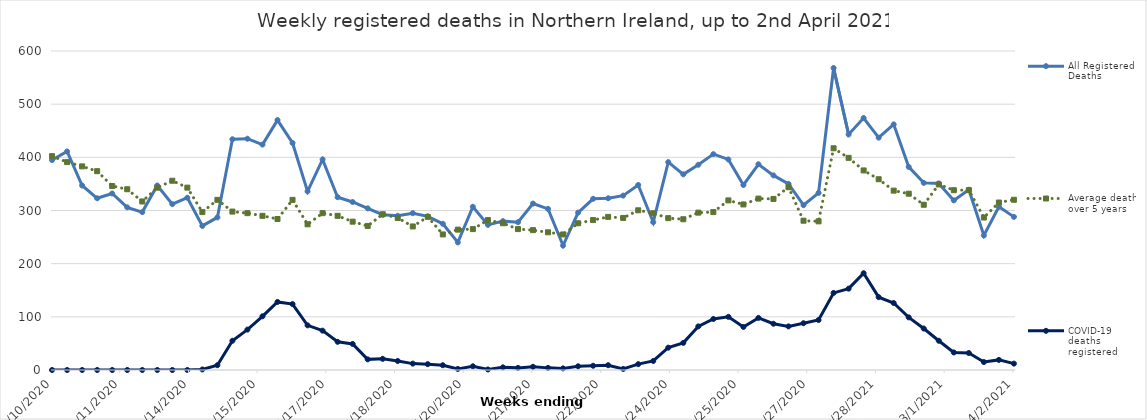
| Category | All Registered Deaths | Average deaths over 5 years | COVID-19 deaths registered |
|---|---|---|---|
| 1/10/20 | 395 | 402.2 | 0 |
| 1/17/20 | 411 | 391 | 0 |
| 1/24/20 | 347 | 383 | 0 |
| 1/31/20 | 323 | 374 | 0 |
| 2/7/20 | 332 | 346 | 0 |
| 2/14/20 | 306 | 340 | 0 |
| 2/21/20 | 297 | 317 | 0 |
| 2/28/20 | 347 | 343 | 0 |
| 3/6/20 | 312 | 356 | 0 |
| 3/13/20 | 324 | 343 | 0 |
| 3/20/20 | 271 | 297 | 1 |
| 3/27/20 | 287 | 320 | 9 |
| 4/3/20 | 434 | 298 | 55 |
| 4/10/20 | 435 | 295 | 76 |
| 4/17/20 | 424 | 290 | 101 |
| 4/24/20 | 470 | 284 | 128 |
| 5/1/20 | 427 | 320 | 124 |
| 5/8/20 | 336 | 274 | 84 |
| 5/15/20 | 396 | 295 | 74 |
| 5/22/20 | 325 | 290 | 53 |
| 5/29/20 | 316 | 279 | 49 |
| 6/5/20 | 304 | 271 | 20 |
| 6/12/20 | 292 | 293 | 21 |
| 6/19/20 | 290 | 286 | 17 |
| 6/26/20 | 295 | 270 | 12 |
| 7/3/20 | 289 | 288 | 11 |
| 7/10/20 | 275 | 255 | 9 |
| 7/17/20 | 240 | 264 | 2 |
| 7/24/20 | 307 | 265 | 7 |
| 7/31/20 | 273 | 282 | 1 |
| 8/7/20 | 280 | 276 | 5 |
| 8/14/20 | 278 | 265 | 4 |
| 8/21/20 | 313 | 263 | 6 |
| 8/28/20 | 303 | 259 | 4 |
| 9/4/20 | 234 | 255 | 3 |
| 9/11/20 | 296 | 276 | 7 |
| 9/18/20 | 322 | 282 | 8 |
| 9/25/20 | 323 | 288 | 9 |
| 10/2/20 | 328 | 286 | 2 |
| 10/9/20 | 348 | 300.4 | 11 |
| 10/16/20 | 278 | 294.8 | 17 |
| 10/23/20 | 391 | 285.6 | 42 |
| 10/30/20 | 368 | 283.6 | 51 |
| 11/6/20 | 386 | 296 | 82 |
| 11/13/20 | 406 | 297 | 96 |
| 11/20/20 | 396 | 319 | 100 |
| 11/27/20 | 348 | 311.4 | 81 |
| 12/4/20 | 387 | 322.4 | 98 |
| 12/11/20 | 366 | 321.8 | 87 |
| 12/18/20 | 350 | 343.8 | 82 |
| 12/25/20 | 310 | 280.8 | 88 |
| 1/1/21 | 333 | 279.6 | 94 |
| 1/8/21 | 568 | 417 | 145 |
| 1/15/21 | 443 | 399 | 153 |
| 1/22/21 | 474 | 375.4 | 182 |
| 1/29/21 | 437 | 358.8 | 137 |
| 2/5/21 | 462 | 337.4 | 126 |
| 2/12/21 | 382 | 331.6 | 99 |
| 2/19/21 | 352 | 310.8 | 78 |
| 2/26/21 | 351 | 349 | 55 |
| 3/5/21 | 319 | 338.2 | 33 |
| 3/12/21 | 339 | 338.4 | 32 |
| 3/19/21 | 253 | 286.8 | 15 |
| 3/26/21 | 307 | 315 | 19 |
| 4/2/21 | 288 | 320.2 | 12 |